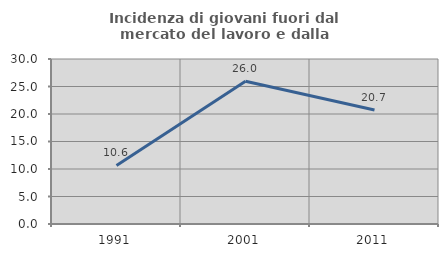
| Category | Incidenza di giovani fuori dal mercato del lavoro e dalla formazione  |
|---|---|
| 1991.0 | 10.65 |
| 2001.0 | 25.962 |
| 2011.0 | 20.721 |